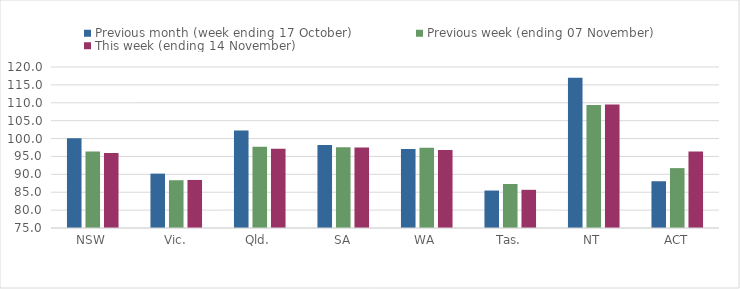
| Category | Previous month (week ending 17 October) | Previous week (ending 07 November) | This week (ending 14 November) |
|---|---|---|---|
| NSW | 100.08 | 96.4 | 95.98 |
| Vic. | 90.19 | 88.35 | 88.43 |
| Qld. | 102.27 | 97.68 | 97.15 |
| SA | 98.18 | 97.56 | 97.52 |
| WA | 97.07 | 97.4 | 96.77 |
| Tas. | 85.47 | 87.3 | 85.67 |
| NT | 117.01 | 109.39 | 109.51 |
| ACT | 88.07 | 91.74 | 96.39 |